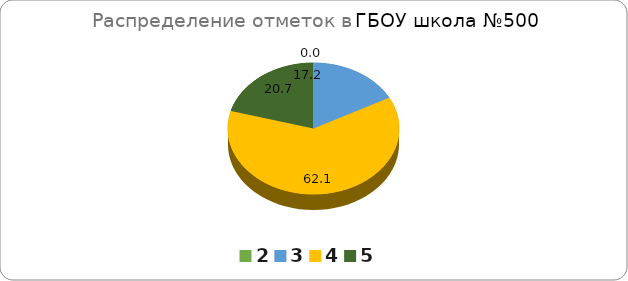
| Category | ГБОУ СОШ №500 |
|---|---|
| 2.0 | 0 |
| 3.0 | 17.24 |
| 4.0 | 62.07 |
| 5.0 | 20.69 |